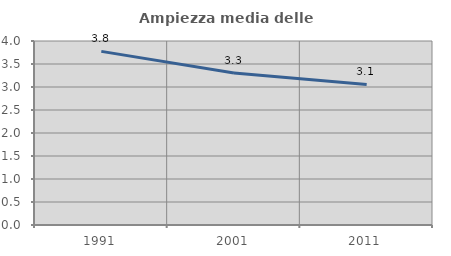
| Category | Ampiezza media delle famiglie |
|---|---|
| 1991.0 | 3.775 |
| 2001.0 | 3.306 |
| 2011.0 | 3.056 |